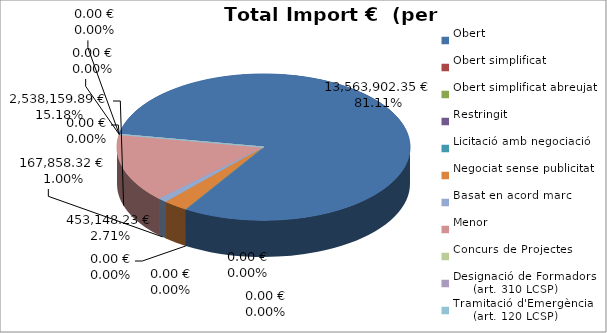
| Category | Total preu
(amb IVA) |
|---|---|
| Obert | 13563902.35 |
| Obert simplificat | 0 |
| Obert simplificat abreujat | 0 |
| Restringit | 0 |
| Licitació amb negociació | 0 |
| Negociat sense publicitat | 453148.23 |
| Basat en acord marc | 167858.32 |
| Menor | 2538159.89 |
| Concurs de Projectes | 0 |
| Designació de Formadors
     (art. 310 LCSP) | 0 |
| Tramitació d'Emergència
     (art. 120 LCSP) | 0 |